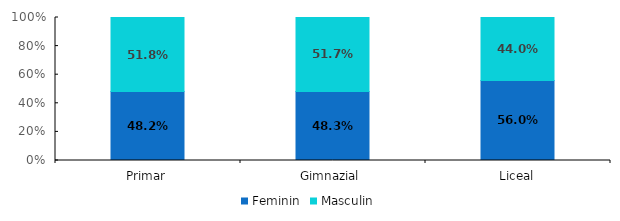
| Category | Feminin | Masculin |
|---|---|---|
| Primar | 48.2 | 51.8 |
| Gimnazial | 48.3 | 51.7 |
| Liceal | 56 | 44 |